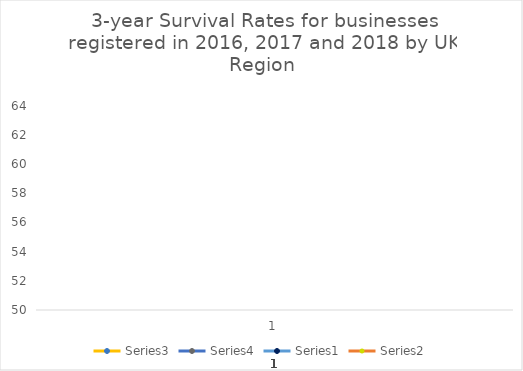
| Category | Series 3 | Series 4 | Series 0 | Series 1 |
|---|---|---|---|---|
| 0 | 1 | 1 | 1 | 1 |